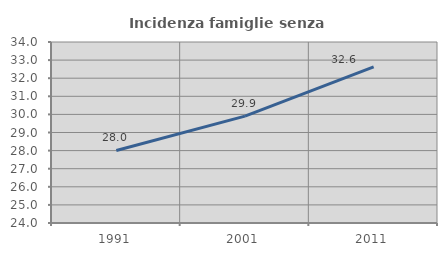
| Category | Incidenza famiglie senza nuclei |
|---|---|
| 1991.0 | 28.006 |
| 2001.0 | 29.903 |
| 2011.0 | 32.63 |